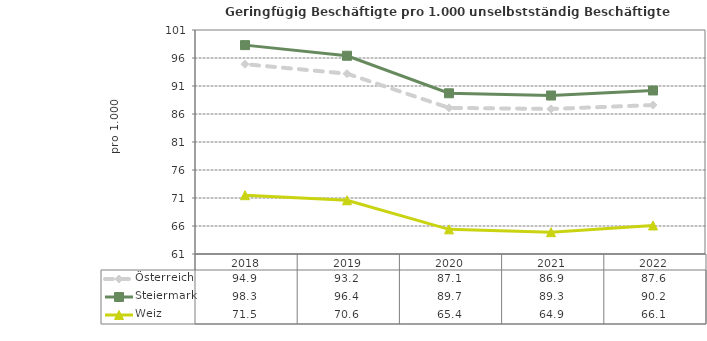
| Category | Österreich | Steiermark | Weiz |
|---|---|---|---|
| 2022.0 | 87.6 | 90.2 | 66.1 |
| 2021.0 | 86.9 | 89.3 | 64.9 |
| 2020.0 | 87.1 | 89.7 | 65.4 |
| 2019.0 | 93.2 | 96.4 | 70.6 |
| 2018.0 | 94.9 | 98.3 | 71.5 |